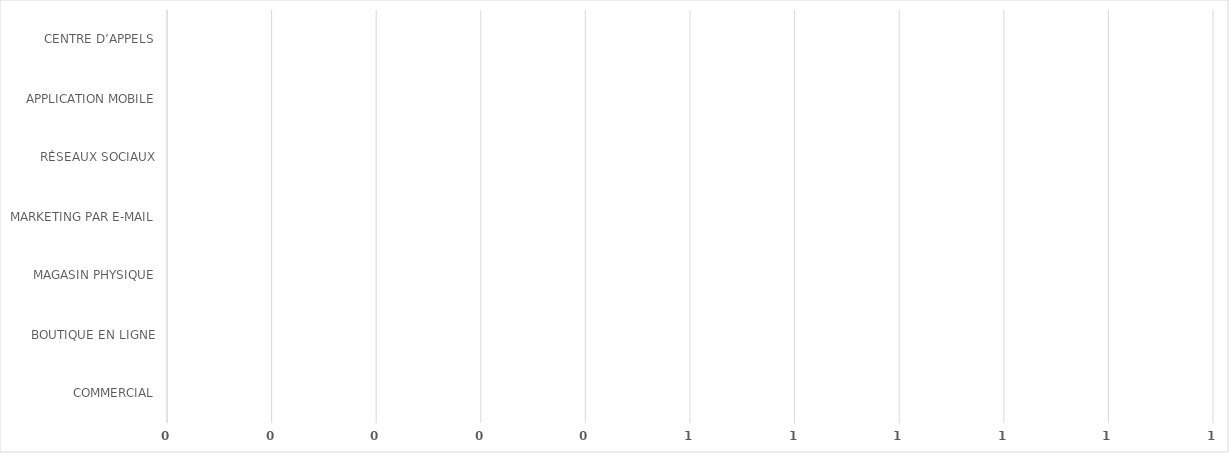
| Category | Series 0 |
|---|---|
| COMMERCIAL | 0 |
| BOUTIQUE EN LIGNE | 0 |
| MAGASIN PHYSIQUE | 0 |
| MARKETING PAR E-MAIL | 0 |
| RÉSEAUX SOCIAUX | 0 |
| APPLICATION MOBILE | 0 |
| CENTRE D’APPELS | 0 |